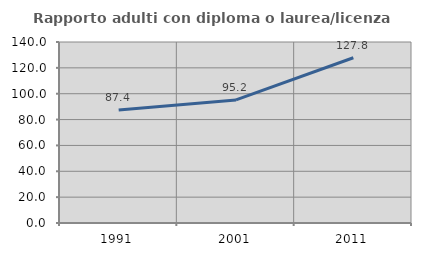
| Category | Rapporto adulti con diploma o laurea/licenza media  |
|---|---|
| 1991.0 | 87.396 |
| 2001.0 | 95.207 |
| 2011.0 | 127.799 |